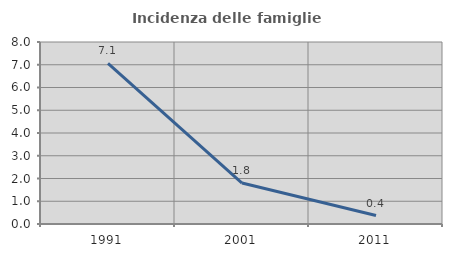
| Category | Incidenza delle famiglie numerose |
|---|---|
| 1991.0 | 7.059 |
| 2001.0 | 1.802 |
| 2011.0 | 0.373 |